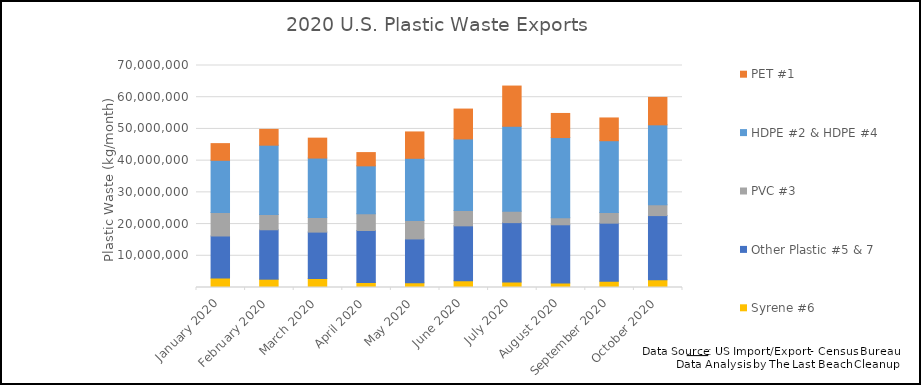
| Category | Syrene #6 | Other Plastic #5 & 7 | PVC #3 | HDPE #2 & HDPE #4 | PET #1 |
|---|---|---|---|---|---|
| January 2020 | 2958916 | 13285086 | 7426769 | 16436399 | 5259408 |
| February 2020 | 2623907 | 15577584 | 4812907 | 21859996 | 4982316 |
| March 2020 | 2800389 | 14664089 | 4570299 | 18776957 | 6283098 |
| April 2020 | 1606355 | 16369773 | 5277863 | 15106196 | 4180736 |
| May 2020 | 1462550 | 13845288 | 5851310 | 19579466 | 8312795 |
| June 2020 | 2111601 | 17329790 | 4851727 | 22549657 | 9421094 |
| July 2020 | 1696043 | 18761692 | 3597171 | 26784296 | 12680765 |
| August 2020 | 1400261 | 18374209 | 2245935 | 25261591 | 7595366 |
| September 2020 | 1990177 | 18297490 | 3357776 | 22639164 | 7176769 |
| October 2020 | 2407167 | 20264810 | 3409424 | 25207694 | 8655286 |